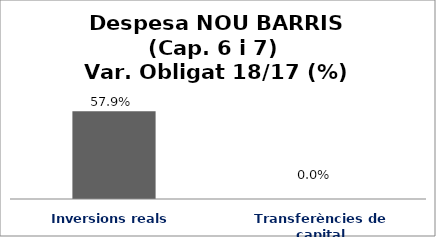
| Category | Series 0 |
|---|---|
| Inversions reals | 0.579 |
| Transferències de capital | 0 |